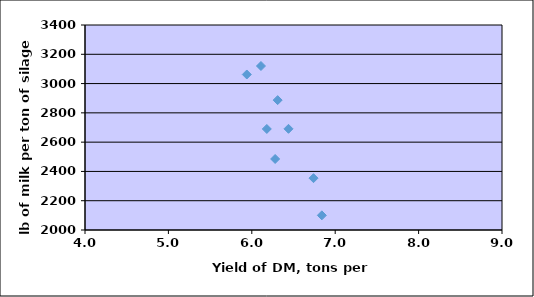
| Category | Series 0 |
|---|---|
| 6.11 | 3120 |
| 5.94 | 3062 |
| 6.84 | 2100 |
| 6.18 | 2690 |
| 6.28 | 2485 |
| 6.44 | 2691 |
| 6.31 | 2887 |
| 6.74 | 2354 |